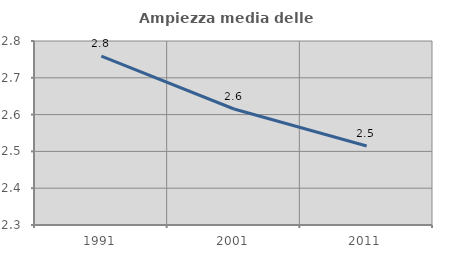
| Category | Ampiezza media delle famiglie |
|---|---|
| 1991.0 | 2.759 |
| 2001.0 | 2.615 |
| 2011.0 | 2.515 |